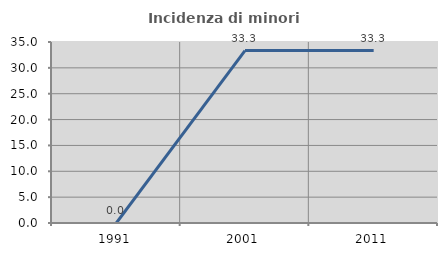
| Category | Incidenza di minori stranieri |
|---|---|
| 1991.0 | 0 |
| 2001.0 | 33.333 |
| 2011.0 | 33.333 |